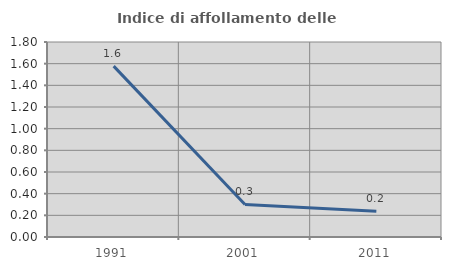
| Category | Indice di affollamento delle abitazioni  |
|---|---|
| 1991.0 | 1.577 |
| 2001.0 | 0.3 |
| 2011.0 | 0.237 |